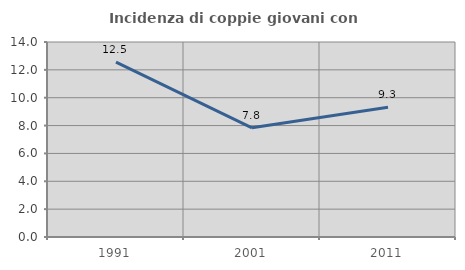
| Category | Incidenza di coppie giovani con figli |
|---|---|
| 1991.0 | 12.549 |
| 2001.0 | 7.836 |
| 2011.0 | 9.317 |